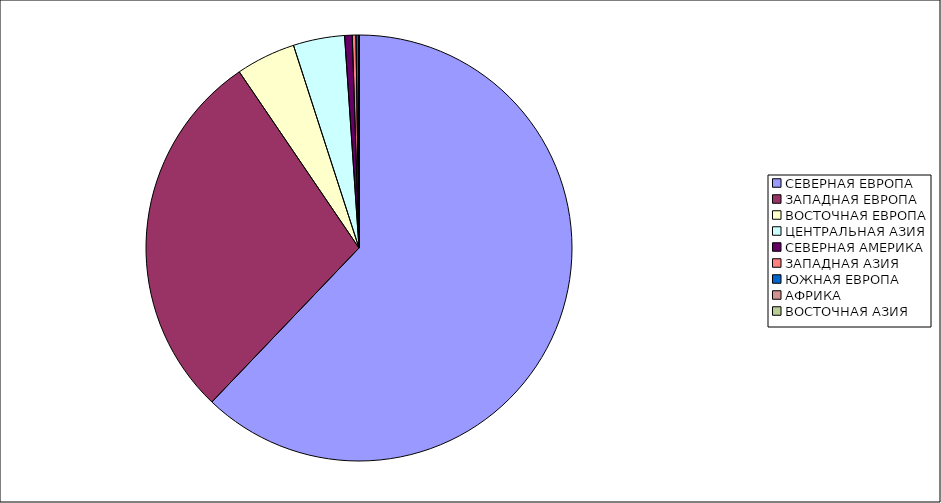
| Category | Оборот |
|---|---|
| СЕВЕРНАЯ ЕВРОПА | 62.137 |
| ЗАПАДНАЯ ЕВРОПА | 28.362 |
| ВОСТОЧНАЯ ЕВРОПА | 4.524 |
| ЦЕНТРАЛЬНАЯ АЗИЯ | 3.895 |
| СЕВЕРНАЯ АМЕРИКА | 0.576 |
| ЗАПАДНАЯ АЗИЯ | 0.277 |
| ЮЖНАЯ ЕВРОПА | 0.225 |
| АФРИКА | 0.003 |
| ВОСТОЧНАЯ АЗИЯ | 0.001 |